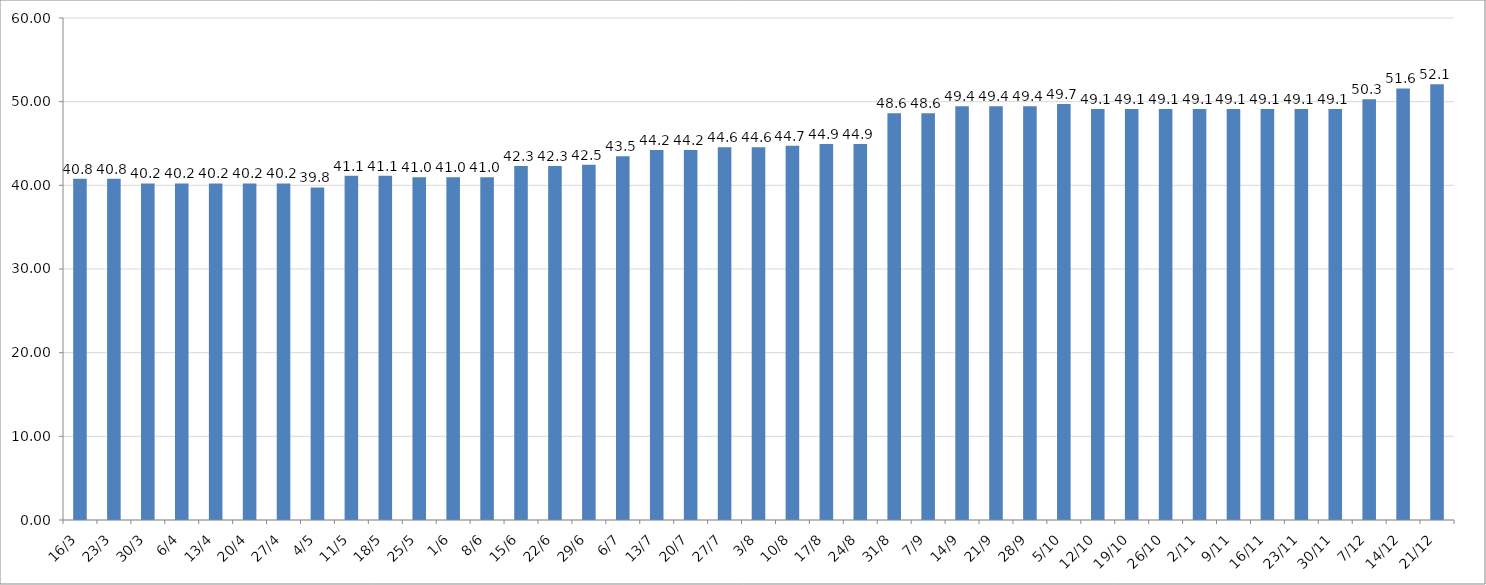
| Category | Series 0 |
|---|---|
| 2020-03-16 | 40.8 |
| 2020-03-23 | 40.8 |
| 2020-03-30 | 40.233 |
| 2020-04-06 | 40.233 |
| 2020-04-13 | 40.233 |
| 2020-04-20 | 40.233 |
| 2020-04-27 | 40.233 |
| 2020-05-04 | 39.75 |
| 2020-05-11 | 41.133 |
| 2020-05-18 | 41.133 |
| 2020-05-25 | 40.967 |
| 2020-06-01 | 40.967 |
| 2020-06-08 | 40.967 |
| 2020-06-15 | 42.3 |
| 2020-06-22 | 42.3 |
| 2020-06-29 | 42.467 |
| 2020-07-06 | 43.467 |
| 2020-07-13 | 44.225 |
| 2020-07-20 | 44.225 |
| 2020-07-27 | 44.558 |
| 2020-08-03 | 44.558 |
| 2020-08-10 | 44.725 |
| 2020-08-17 | 44.942 |
| 2020-08-24 | 44.942 |
| 2020-08-31 | 48.608 |
| 2020-09-07 | 48.608 |
| 2020-09-14 | 49.442 |
| 2020-09-21 | 49.442 |
| 2020-09-28 | 49.442 |
| 2020-10-05 | 49.733 |
| 2020-10-12 | 49.125 |
| 2020-10-19 | 49.125 |
| 2020-10-26 | 49.125 |
| 2020-11-02 | 49.125 |
| 2020-11-09 | 49.125 |
| 2020-11-16 | 49.125 |
| 2020-11-23 | 49.125 |
| 2020-11-30 | 49.125 |
| 2020-12-07 | 50.292 |
| 2020-12-14 | 51.583 |
| 2020-12-21 | 52.083 |